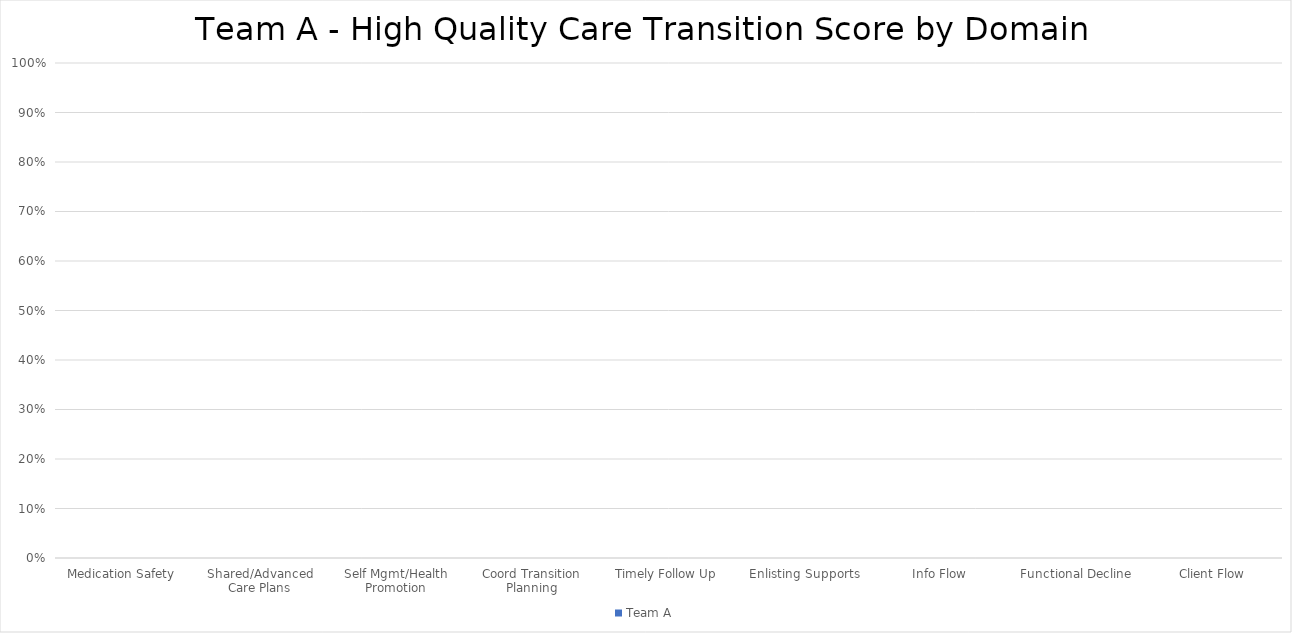
| Category | Team A |
|---|---|
| Medication Safety | 0 |
| Shared/Advanced Care Plans | 0 |
| Self Mgmt/Health Promotion | 0 |
| Coord Transition Planning | 0 |
| Timely Follow Up | 0 |
| Enlisting Supports | 0 |
| Info Flow | 0 |
| Functional Decline | 0 |
| Client Flow | 0 |